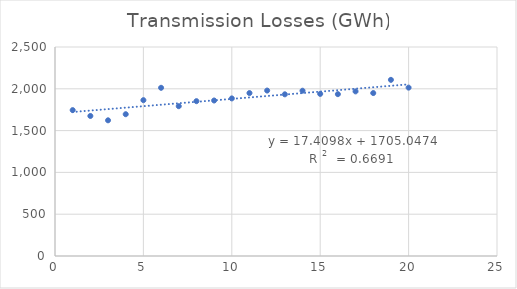
| Category | Series 0 |
|---|---|
| 1.0 | 1745 |
| 2.0 | 1675 |
| 3.0 | 1623 |
| 4.0 | 1696 |
| 5.0 | 1864 |
| 6.0 | 2012 |
| 7.0 | 1792 |
| 8.0 | 1852 |
| 9.0 | 1860 |
| 10.0 | 1885 |
| 11.0 | 1949 |
| 12.0 | 1979 |
| 13.0 | 1934 |
| 14.0 | 1977 |
| 15.0 | 1939 |
| 16.0 | 1936 |
| 17.0 | 1969 |
| 18.0 | 1949 |
| 19.0 | 2107 |
| 20.0 | 2014 |